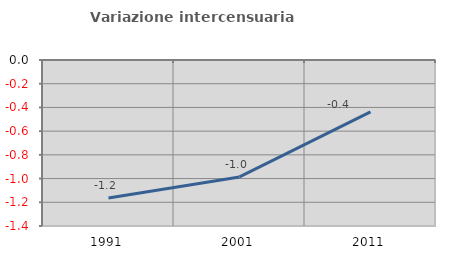
| Category | Variazione intercensuaria annua |
|---|---|
| 1991.0 | -1.164 |
| 2001.0 | -0.986 |
| 2011.0 | -0.437 |